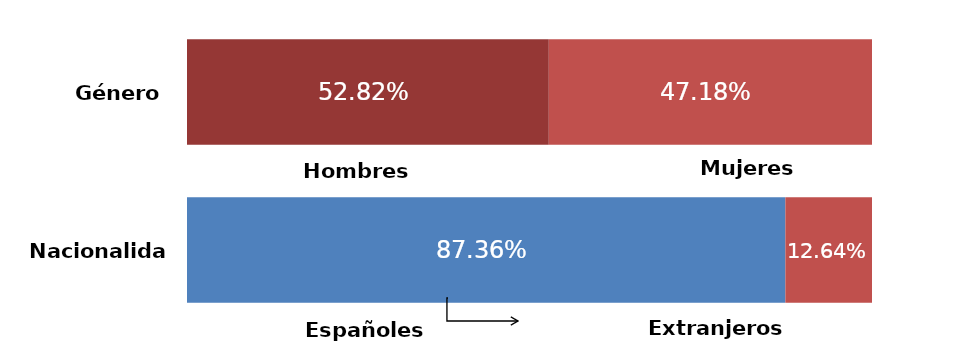
| Category | Series 0 | Series 1 |
|---|---|---|
| 0 | 0.528 | 0.472 |
| 1 | 0.874 | 0.126 |